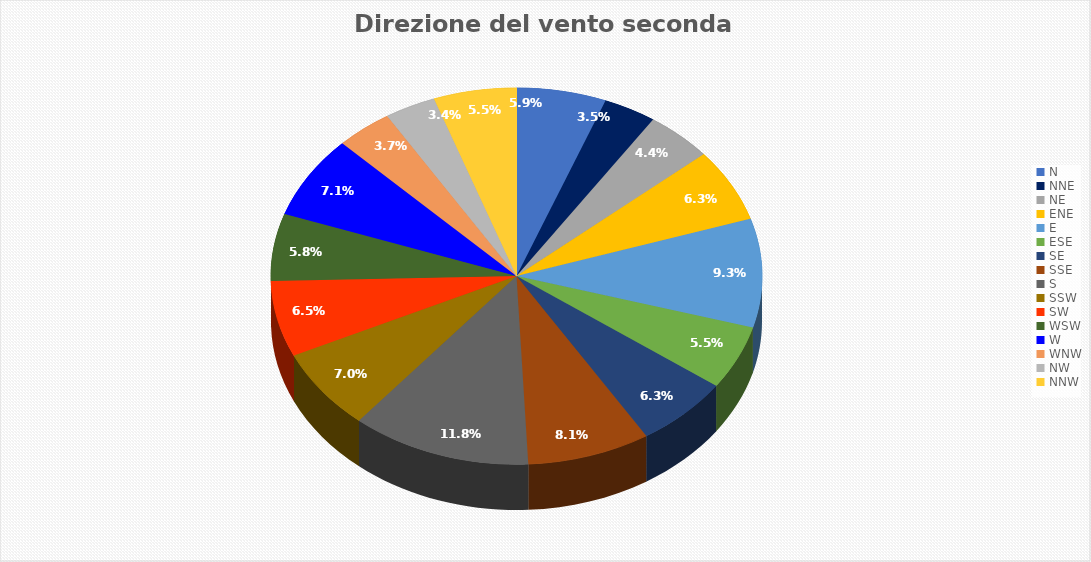
| Category | Percentuale |
|---|---|
| N | 5.903 |
| NNE | 3.472 |
| NE | 4.41 |
| ENE | 6.285 |
| E | 9.34 |
| ESE | 5.486 |
| SE | 6.25 |
| SSE | 8.09 |
| S | 11.84 |
| SSW | 6.979 |
| SW | 6.528 |
| WSW | 5.764 |
| W | 7.118 |
| WNW | 3.715 |
| NW | 3.368 |
| NNW | 5.451 |